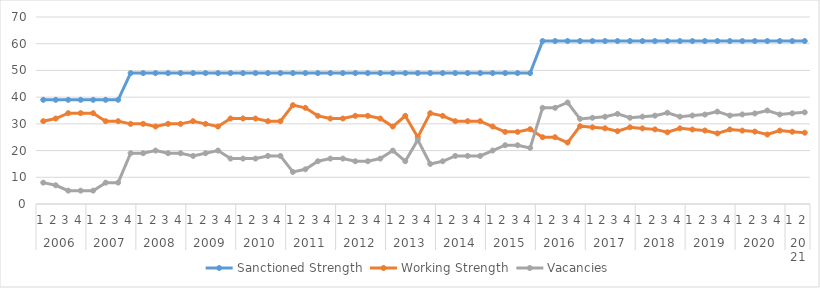
| Category | Sanctioned Strength | Working Strength | Vacancies |
|---|---|---|---|
| 0 | 39 | 31 | 8 |
| 1 | 39 | 32 | 7 |
| 2 | 39 | 34 | 5 |
| 3 | 39 | 34 | 5 |
| 4 | 39 | 34 | 5 |
| 5 | 39 | 31 | 8 |
| 6 | 39 | 31 | 8 |
| 7 | 49 | 30 | 19 |
| 8 | 49 | 30 | 19 |
| 9 | 49 | 29 | 20 |
| 10 | 49 | 30 | 19 |
| 11 | 49 | 30 | 19 |
| 12 | 49 | 31 | 18 |
| 13 | 49 | 30 | 19 |
| 14 | 49 | 29 | 20 |
| 15 | 49 | 32 | 17 |
| 16 | 49 | 32 | 17 |
| 17 | 49 | 32 | 17 |
| 18 | 49 | 31 | 18 |
| 19 | 49 | 31 | 18 |
| 20 | 49 | 37 | 12 |
| 21 | 49 | 36 | 13 |
| 22 | 49 | 33 | 16 |
| 23 | 49 | 32 | 17 |
| 24 | 49 | 32 | 17 |
| 25 | 49 | 33 | 16 |
| 26 | 49 | 33 | 16 |
| 27 | 49 | 32 | 17 |
| 28 | 49 | 29 | 20 |
| 29 | 49 | 33 | 16 |
| 30 | 49 | 25 | 24 |
| 31 | 49 | 34 | 15 |
| 32 | 49 | 33 | 16 |
| 33 | 49 | 31 | 18 |
| 34 | 49 | 31 | 18 |
| 35 | 49 | 31 | 18 |
| 36 | 49 | 29 | 20 |
| 37 | 49 | 27 | 22 |
| 38 | 49 | 27 | 22 |
| 39 | 49 | 28 | 21 |
| 40 | 61 | 25 | 36 |
| 41 | 61 | 25 | 36 |
| 42 | 61 | 23 | 38 |
| 43 | 61 | 29.133 | 31.867 |
| 44 | 61 | 28.709 | 32.291 |
| 45 | 61 | 28.345 | 32.655 |
| 46 | 61 | 27.255 | 33.745 |
| 47 | 61 | 28.721 | 32.279 |
| 48 | 61 | 28.297 | 32.703 |
| 49 | 61 | 27.933 | 33.067 |
| 50 | 61 | 26.842 | 34.158 |
| 51 | 61 | 28.309 | 32.691 |
| 52 | 61 | 27.885 | 33.115 |
| 53 | 61 | 27.521 | 33.479 |
| 54 | 61 | 26.43 | 34.57 |
| 55 | 61 | 27.897 | 33.103 |
| 56 | 61 | 27.473 | 33.527 |
| 57 | 61 | 27.109 | 33.891 |
| 58 | 61 | 26.018 | 34.982 |
| 59 | 61 | 27.485 | 33.515 |
| 60 | 61 | 27.061 | 33.939 |
| 61 | 61 | 26.697 | 34.303 |